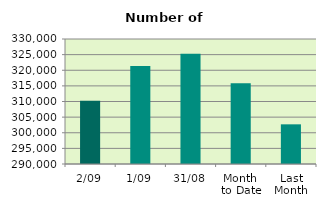
| Category | Series 0 |
|---|---|
| 2/09 | 310262 |
| 1/09 | 321382 |
| 31/08 | 325254 |
| Month 
to Date | 315822 |
| Last
Month | 302693.565 |